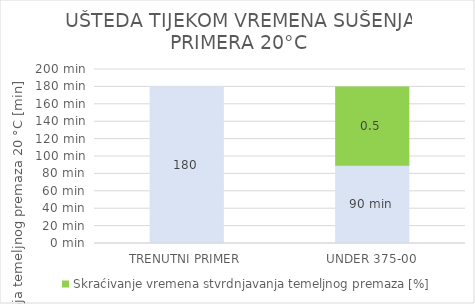
| Category | Vrijeme stvrdnjavanja temeljnog premaza 20 °C [min] | Skraćivanje vremena stvrdnjavanja temeljnog premaza [%] |
|---|---|---|
| TRENUTNI PRIMER | 180 | 0 |
| UNDER 375-00 | 90 | 90 |